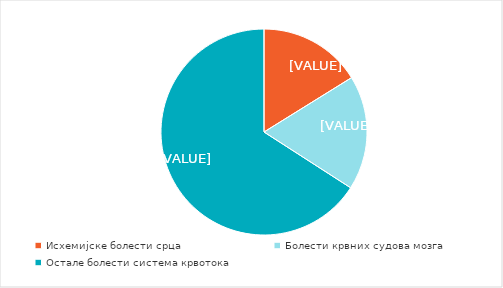
| Category | Женe |
|---|---|
| Исхемијске болести срца  | 16.155 |
| Болести крвних судова мозга  | 17.953 |
| Остале болести система крвотока  | 65.892 |